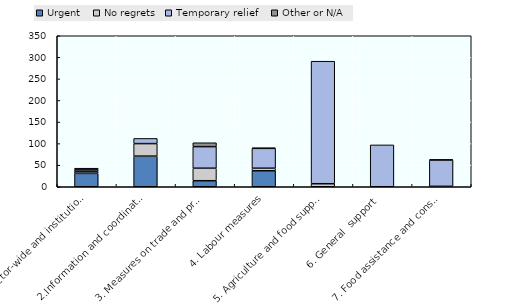
| Category | Urgent  | No regrets | Temporary relief  | Other or N/A |
|---|---|---|---|---|
| 1.Sector-wide and institutional measures | 31 | 4 | 4 | 4 |
| 2.Information and coordination measures | 71 | 29 | 12 | 0 |
| 3. Measures on trade and product flows | 14 | 29 | 50 | 9 |
| 4. Labour measures | 37 | 6 | 46 | 1 |
| 5. Agriculture and food support | 0 | 7 | 284 | 0 |
| 6. General  support | 0 | 0 | 97 | 0 |
| 7. Food assistance and consumer support | 0 | 1 | 61 | 1 |